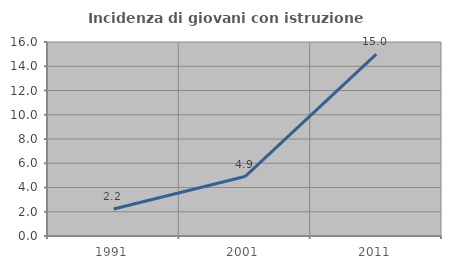
| Category | Incidenza di giovani con istruzione universitaria |
|---|---|
| 1991.0 | 2.222 |
| 2001.0 | 4.902 |
| 2011.0 | 15 |